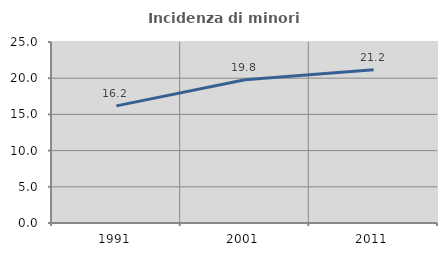
| Category | Incidenza di minori stranieri |
|---|---|
| 1991.0 | 16.176 |
| 2001.0 | 19.774 |
| 2011.0 | 21.164 |